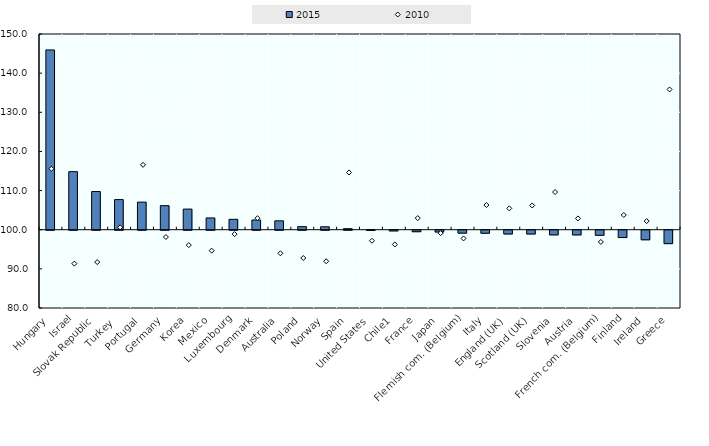
| Category | 2015 |
|---|---|
| Hungary | 145.936 |
| Israel | 114.836 |
| Slovak Republic | 109.755 |
| Turkey  | 107.696 |
| Portugal | 107.05 |
| Germany | 106.146 |
| Korea | 105.271 |
| Mexico | 103.009 |
| Luxembourg | 102.657 |
| Denmark | 102.482 |
| Australia | 102.268 |
| Poland | 100.783 |
| Norway | 100.746 |
| Spain | 100.265 |
| United States | 99.949 |
| Chile1 | 99.821 |
| France | 99.617 |
| Japan | 99.542 |
| Flemish com. (Belgium) | 99.256 |
| Italy | 99.222 |
| England (UK) | 99.038 |
| Scotland (UK) | 99.034 |
| Slovenia | 98.81 |
| Austria | 98.798 |
| French com. (Belgium) | 98.704 |
| Finland | 98.129 |
| Ireland | 97.554 |
| Greece | 96.573 |